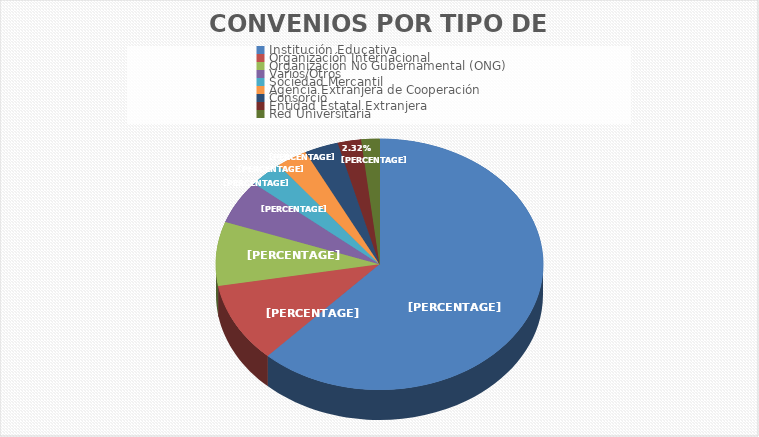
| Category | CONVENIOS | PORCENTAJE |
|---|---|---|
| Institución Educativa | 241 | 0.62 |
| Organización Internacional | 40 | 0.103 |
| Organización No Gubernamental (ONG) | 32 | 0.082 |
| Varios/Otros  | 22 | 0.057 |
| Sociedad Mercantil | 13 | 0.033 |
| Agencia Extranjera de Cooperación | 12 | 0.031 |
| Consorcio | 13 | 0.033 |
| Entidad Estatal Extranjera | 9 | 0.023 |
| Red Universitaria | 7 | 0.018 |